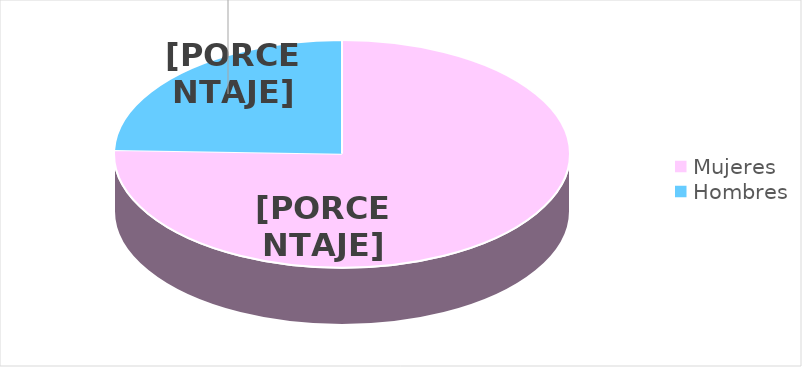
| Category | Series 0 |
|---|---|
| Mujeres | 71 |
| Hombres | 23 |